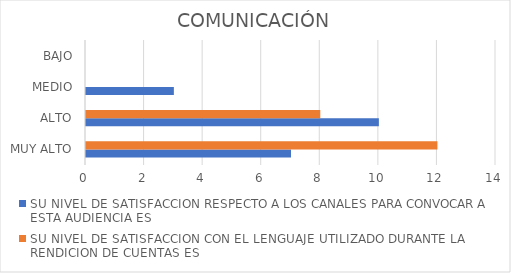
| Category | SU NIVEL DE SATISFACCION RESPECTO A LOS CANALES PARA CONVOCAR A ESTA AUDIENCIA ES | SU NIVEL DE SATISFACCION CON EL LENGUAJE UTILIZADO DURANTE LA RENDICION DE CUENTAS ES |
|---|---|---|
| MUY ALTO | 7 | 12 |
| ALTO | 10 | 8 |
| MEDIO | 3 | 0 |
| BAJO | 0 | 0 |